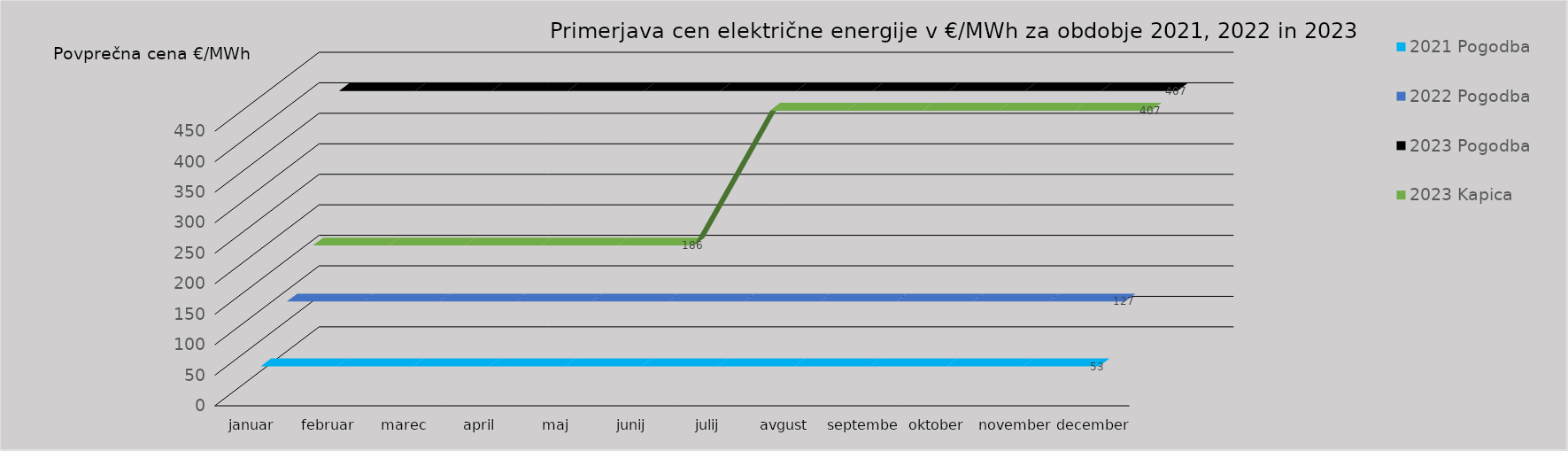
| Category | 2021 Pogodba | 2022 Pogodba | 2023 Pogodba | 2023 Kapica |
|---|---|---|---|---|
| januar | 52.815 | 126.735 | 407.08 | 186.25 |
| februar | 52.815 | 126.735 | 407.08 | 186.25 |
| marec | 52.815 | 126.735 | 407.08 | 186.25 |
| april | 52.815 | 126.735 | 407.08 | 186.25 |
| maj | 52.815 | 126.735 | 407.08 | 186.25 |
| junij | 52.815 | 126.735 | 407.08 | 186.25 |
| julij | 52.815 | 126.735 | 407.08 | 407.08 |
| avgust | 52.815 | 126.735 | 407.08 | 407.08 |
| september | 52.815 | 126.735 | 407.08 | 407.08 |
| oktober | 52.815 | 126.735 | 407.08 | 407.08 |
| november | 52.815 | 126.735 | 407.08 | 407.08 |
| december | 52.815 | 126.735 | 407.08 | 407.08 |